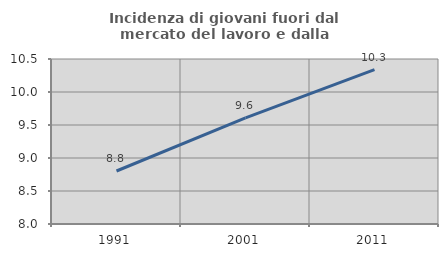
| Category | Incidenza di giovani fuori dal mercato del lavoro e dalla formazione  |
|---|---|
| 1991.0 | 8.803 |
| 2001.0 | 9.609 |
| 2011.0 | 10.338 |